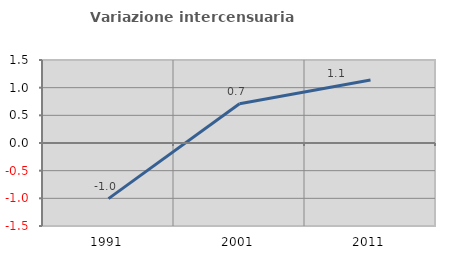
| Category | Variazione intercensuaria annua |
|---|---|
| 1991.0 | -1.006 |
| 2001.0 | 0.709 |
| 2011.0 | 1.137 |